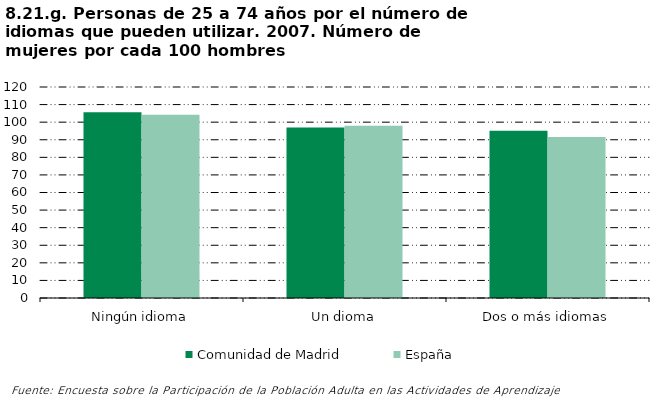
| Category | Comunidad de Madrid | España |
|---|---|---|
| Ningún idioma | 105.7 | 104.211 |
| Un dioma | 96.984 | 98.019 |
| Dos o más idiomas | 95.165 | 91.589 |